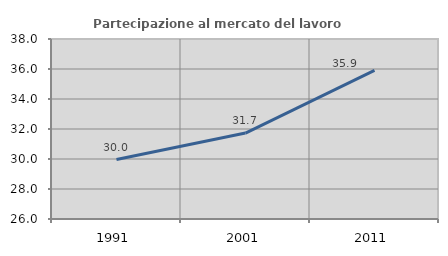
| Category | Partecipazione al mercato del lavoro  femminile |
|---|---|
| 1991.0 | 29.963 |
| 2001.0 | 31.729 |
| 2011.0 | 35.911 |